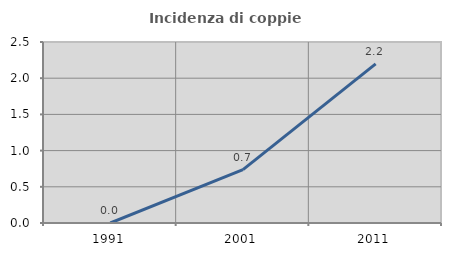
| Category | Incidenza di coppie miste |
|---|---|
| 1991.0 | 0 |
| 2001.0 | 0.737 |
| 2011.0 | 2.198 |